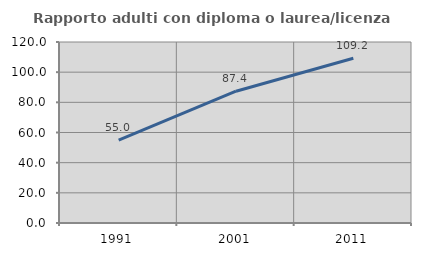
| Category | Rapporto adulti con diploma o laurea/licenza media  |
|---|---|
| 1991.0 | 54.959 |
| 2001.0 | 87.388 |
| 2011.0 | 109.184 |